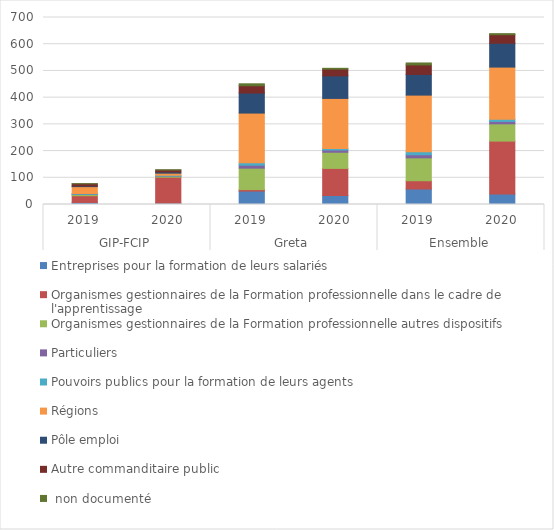
| Category | Entreprises pour la formation de leurs salariés | Organismes gestionnaires de la Formation professionnelle dans le cadre de l'apprentissage | Organismes gestionnaires de la Formation professionnelle autres dispositifs | Particuliers | Pouvoirs publics pour la formation de leurs agents | Régions | Pôle emploi | Autre commanditaire public |  non documenté |
|---|---|---|---|---|---|---|---|---|---|
| 0 | 7.6 | 25.3 | 5.4 | 0.4 | 2.5 | 25.7 | 2.4 | 8.2 | 0.1 |
| 1 | 5.3 | 97 | 4.1 | 0.4 | 2.7 | 7.8 | 4.6 | 7 | 0.9 |
| 2 | 50.2 | 5.6 | 80.2 | 11.1 | 9.2 | 185.9 | 75 | 27.4 | 7.2 |
| 3 | 33.6 | 101.5 | 60.4 | 8.5 | 6 | 187.1 | 84.5 | 25.2 | 3 |
| 4 | 58 | 30.9 | 85.8 | 11.5 | 11.7 | 211.6 | 77.4 | 35.6 | 7.3 |
| 5 | 38.9 | 198.5 | 64.5 | 8.9 | 8.7 | 194.9 | 89.1 | 32.2 | 3.9 |